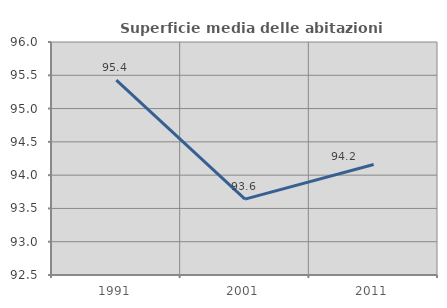
| Category | Superficie media delle abitazioni occupate |
|---|---|
| 1991.0 | 95.427 |
| 2001.0 | 93.641 |
| 2011.0 | 94.159 |